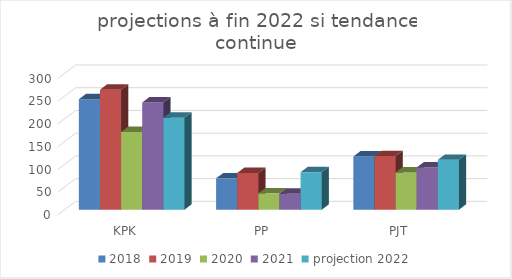
| Category | 2018 | 2019 | 2020 | 2021 | projection 2022 |
|---|---|---|---|---|---|
| KPK | 243 | 264 | 171 | 236 | 202.286 |
| PP | 69 | 81 | 36 | 35 | 82.286 |
| PJT | 117 | 118 | 82 | 93 | 109.714 |